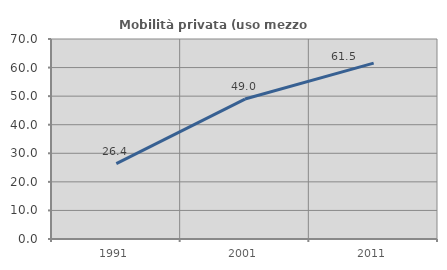
| Category | Mobilità privata (uso mezzo privato) |
|---|---|
| 1991.0 | 26.36 |
| 2001.0 | 48.98 |
| 2011.0 | 61.538 |